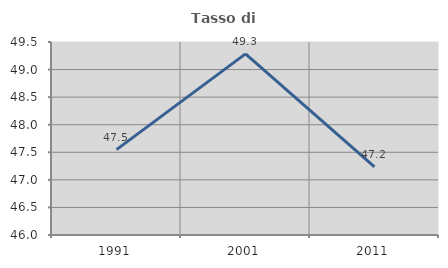
| Category | Tasso di occupazione   |
|---|---|
| 1991.0 | 47.548 |
| 2001.0 | 49.285 |
| 2011.0 | 47.235 |